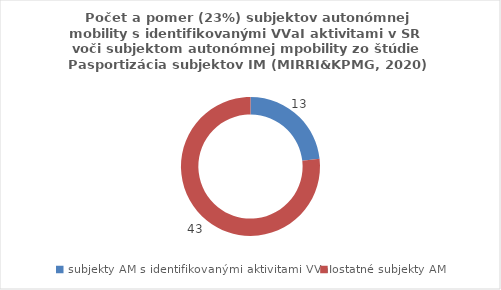
| Category | Series 0 |
|---|---|
| subjekty AM s identifikovanými aktivitami VVaI | 13 |
| ostatné subjekty AM | 43 |